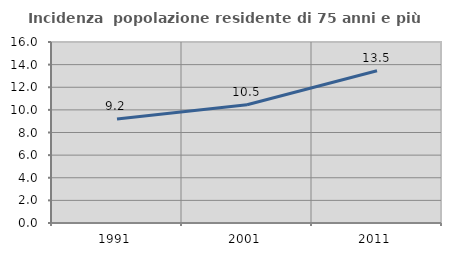
| Category | Incidenza  popolazione residente di 75 anni e più |
|---|---|
| 1991.0 | 9.189 |
| 2001.0 | 10.453 |
| 2011.0 | 13.462 |